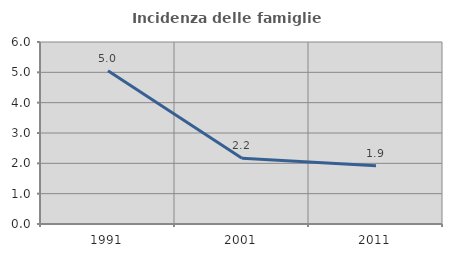
| Category | Incidenza delle famiglie numerose |
|---|---|
| 1991.0 | 5.049 |
| 2001.0 | 2.169 |
| 2011.0 | 1.924 |